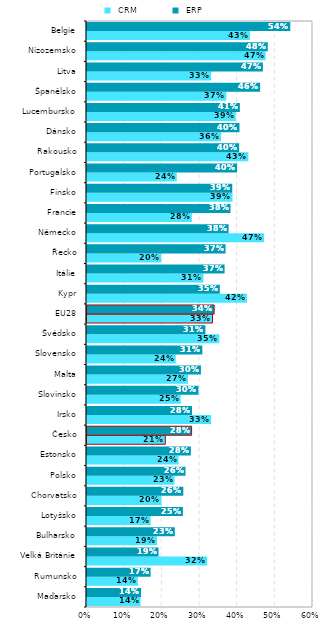
| Category |  CRM |  ERP |
|---|---|---|
| Maďarsko | 0.142 | 0.144 |
| Rumunsko | 0.135 | 0.169 |
| Velká Británie | 0.319 | 0.19 |
| Bulharsko | 0.186 | 0.233 |
| Lotyšsko | 0.169 | 0.255 |
| Chorvatsko | 0.198 | 0.256 |
| Polsko | 0.232 | 0.262 |
| Estonsko | 0.243 | 0.276 |
| Česko | 0.208 | 0.278 |
| Irsko | 0.33 | 0.279 |
| Slovinsko | 0.249 | 0.296 |
| Malta | 0.268 | 0.302 |
| Slovensko | 0.236 | 0.306 |
| Švédsko | 0.351 | 0.314 |
| EU28 | 0.333 | 0.338 |
| Kypr | 0.425 | 0.353 |
| Itálie | 0.309 | 0.365 |
| Řecko | 0.197 | 0.368 |
| Německo | 0.47 | 0.376 |
| Francie | 0.278 | 0.381 |
| Finsko | 0.386 | 0.386 |
| Portugalsko | 0.238 | 0.399 |
| Rakousko | 0.428 | 0.404 |
| Dánsko | 0.356 | 0.405 |
| Lucembursko | 0.395 | 0.406 |
| Španělsko | 0.37 | 0.46 |
| Litva | 0.33 | 0.467 |
| Nizozemsko | 0.474 | 0.48 |
| Belgie | 0.432 | 0.54 |